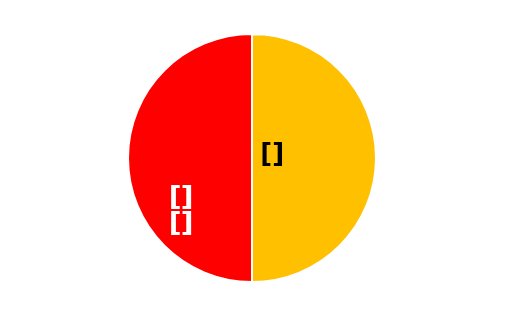
| Category | Series 0 | Series 1 | Series 2 | Series 3 |
|---|---|---|---|---|
| 0 | 29 |  |  | 29 |
| 1 | 0 |  |  | 0 |
| 2 | 29 |  |  | 29 |